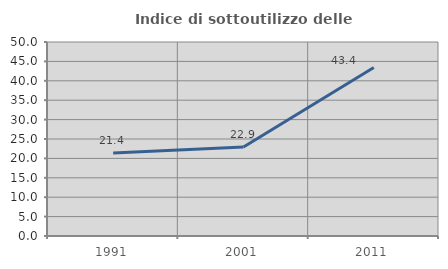
| Category | Indice di sottoutilizzo delle abitazioni  |
|---|---|
| 1991.0 | 21.393 |
| 2001.0 | 22.943 |
| 2011.0 | 43.424 |